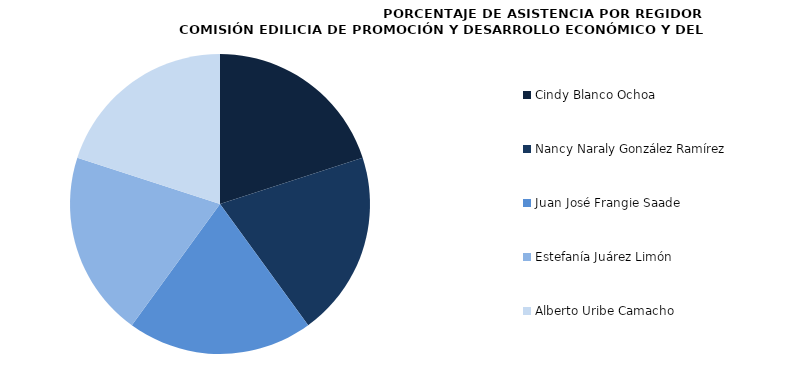
| Category | Series 0 |
|---|---|
| Cindy Blanco Ochoa | 100 |
| Nancy Naraly González Ramírez | 100 |
| Juan José Frangie Saade | 100 |
| Estefanía Juárez Limón | 100 |
| Alberto Uribe Camacho | 100 |